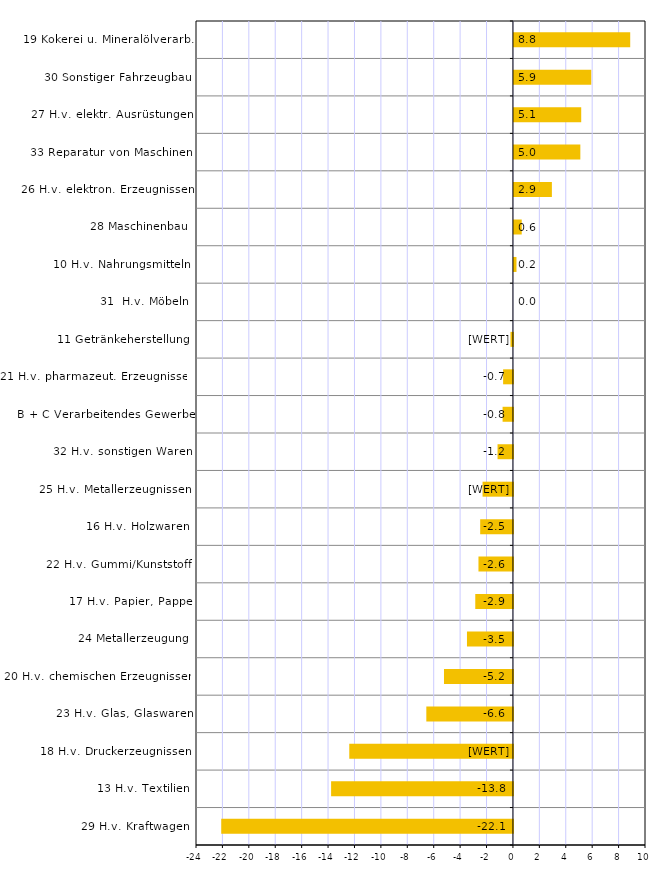
| Category | Series 0 |
|---|---|
| 29 H.v. Kraftwagen | -22.089 |
| 13 H.v. Textilien | -13.769 |
| 18 H.v. Druckerzeugnissen | -12.394 |
| 23 H.v. Glas, Glaswaren | -6.559 |
| 20 H.v. chemischen Erzeugnissen | -5.221 |
| 24 Metallerzeugung | -3.481 |
| 17 H.v. Papier, Pappe | -2.852 |
| 22 H.v. Gummi/Kunststoff | -2.611 |
| 16 H.v. Holzwaren | -2.481 |
| 25 H.v. Metallerzeugnissen | -2.301 |
| 32 H.v. sonstigen Waren | -1.166 |
| B + C Verarbeitendes Gewerbe | -0.784 |
| 21 H.v. pharmazeut. Erzeugnissen | -0.744 |
| 11 Getränkeherstellung | -0.186 |
| 31  H.v. Möbeln | 0 |
| 10 H.v. Nahrungsmitteln | 0.192 |
| 28 Maschinenbau | 0.589 |
| 26 H.v. elektron. Erzeugnissen | 2.873 |
| 33 Reparatur von Maschinen | 5.028 |
| 27 H.v. elektr. Ausrüstungen | 5.095 |
| 30 Sonstiger Fahrzeugbau | 5.854 |
| 19 Kokerei u. Mineralölverarb. | 8.804 |